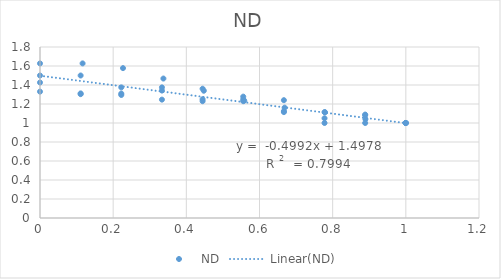
| Category | ND |
|---|---|
| 1.0 | 1 |
| 0.8888888780487805 | 1 |
| 0.777777756097561 | 1 |
| 0.6666666341463414 | 1.125 |
| 0.5555555121951219 | 1.25 |
| 0.4444443902439024 | 1.25 |
| 0.33333326829268295 | 1.375 |
| 0.22222214634146345 | 1.375 |
| 0.11111102439024394 | 1.5 |
| 0.0 | 1.5 |
| 1.0 | 1 |
| 0.8888888888888888 | 1.082 |
| 0.7777777777777778 | 1.115 |
| 0.6666666666666666 | 1.115 |
| 0.5555555555555556 | 1.23 |
| 0.4444444444444444 | 1.23 |
| 0.3333333333333333 | 1.246 |
| 0.2222222222222222 | 1.295 |
| 0.1111111111111111 | 1.311 |
| 0.0 | 1.426 |
| 1.0 | 1 |
| 0.8888888888888888 | 1.089 |
| 0.7777777777777778 | 1.05 |
| 0.6666666666666666 | 1.24 |
| 0.5555555555555556 | 1.277 |
| 0.4444444444444444 | 1.361 |
| 0.3333333333333333 | 1.341 |
| 0.2222222222222222 | 1.31 |
| 0.1111111111111111 | 1.304 |
| 0.0 | 1.33 |
| 1.0 | 1 |
| 0.8895522388059701 | 1.04 |
| 0.7791044776119403 | 1.113 |
| 0.6686567164179105 | 1.162 |
| 0.5582089552238807 | 1.236 |
| 0.44776119402985076 | 1.34 |
| 0.33731343283582094 | 1.468 |
| 0.22686567164179103 | 1.578 |
| 0.11641791044776115 | 1.627 |
| 0.0 | 1.627 |